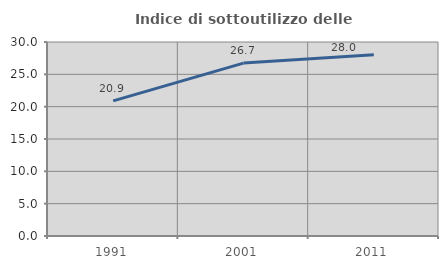
| Category | Indice di sottoutilizzo delle abitazioni  |
|---|---|
| 1991.0 | 20.9 |
| 2001.0 | 26.741 |
| 2011.0 | 28.029 |